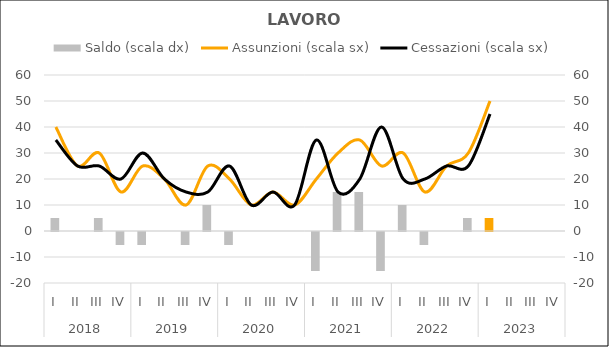
| Category | Saldo (scala dx) |
|---|---|
| 0 | 5 |
| 1 | 0 |
| 2 | 5 |
| 3 | -5 |
| 4 | -5 |
| 5 | 0 |
| 6 | -5 |
| 7 | 10 |
| 8 | -5 |
| 9 | 0 |
| 10 | 0 |
| 11 | 0 |
| 12 | -15 |
| 13 | 15 |
| 14 | 15 |
| 15 | -15 |
| 16 | 10 |
| 17 | -5 |
| 18 | 0 |
| 19 | 5 |
| 20 | 5 |
| 21 | 0 |
| 22 | 0 |
| 23 | 0 |